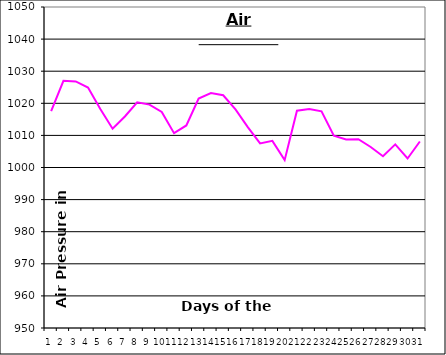
| Category | Series 0 |
|---|---|
| 0 | 1017.6 |
| 1 | 1027 |
| 2 | 1026.8 |
| 3 | 1024.9 |
| 4 | 1018.2 |
| 5 | 1012.1 |
| 6 | 1015.9 |
| 7 | 1020.3 |
| 8 | 1019.6 |
| 9 | 1017.3 |
| 10 | 1010.7 |
| 11 | 1013.1 |
| 12 | 1021.5 |
| 13 | 1023.2 |
| 14 | 1022.5 |
| 15 | 1018.1 |
| 16 | 1012.6 |
| 17 | 1007.5 |
| 18 | 1008.3 |
| 19 | 1002.3 |
| 20 | 1017.7 |
| 21 | 1018.2 |
| 22 | 1017.5 |
| 23 | 1009.9 |
| 24 | 1008.7 |
| 25 | 1008.8 |
| 26 | 1006.4 |
| 27 | 1003.5 |
| 28 | 1007.2 |
| 29 | 1002.8 |
| 30 | 1008.1 |